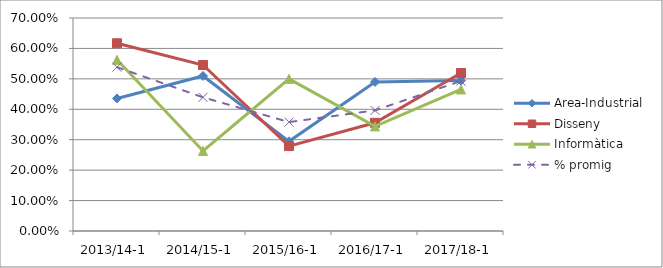
| Category | Area-Industrial | Disseny | Informàtica | % promig |
|---|---|---|---|---|
| 2013/14-1 | 0.436 | 0.617 | 0.562 | 0.538 |
| 2014/15-1 | 0.509 | 0.545 | 0.263 | 0.439 |
| 2015/16-1 | 0.295 | 0.279 | 0.5 | 0.358 |
| 2016/17-1 | 0.49 | 0.356 | 0.344 | 0.396 |
| 2017/18-1 | 0.494 | 0.519 | 0.465 | 0.493 |